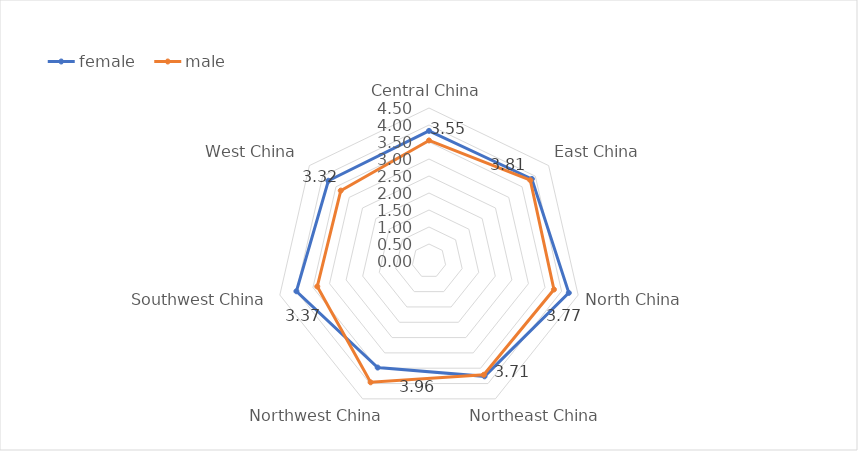
| Category | female | male |
|---|---|---|
| Central China | 3.828 | 3.545 |
| East China | 3.87 | 3.811 |
| North China | 4.217 | 3.769 |
| Northeast China | 3.765 | 3.714 |
| Northwest China | 3.478 | 3.96 |
| Southwest China | 4 | 3.37 |
| West China | 3.786 | 3.32 |